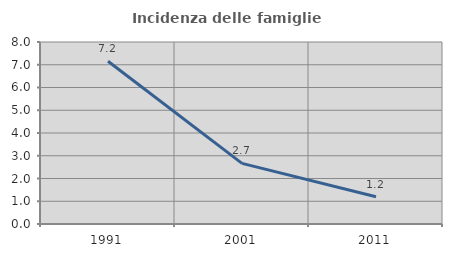
| Category | Incidenza delle famiglie numerose |
|---|---|
| 1991.0 | 7.155 |
| 2001.0 | 2.665 |
| 2011.0 | 1.196 |